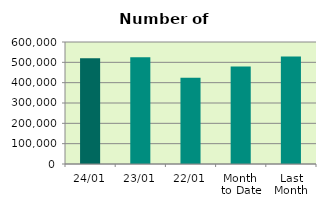
| Category | Series 0 |
|---|---|
| 24/01 | 519490 |
| 23/01 | 525070 |
| 22/01 | 424114 |
| Month 
to Date | 479910.353 |
| Last
Month | 528134.632 |